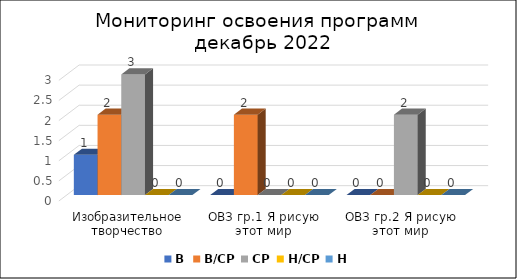
| Category | В | В/СР | СР | Н/СР | Н |
|---|---|---|---|---|---|
| Изобразительное творчество | 1 | 2 | 3 | 0 | 0 |
| ОВЗ гр.1 Я рисую этот мир | 0 | 2 | 0 | 0 | 0 |
| ОВЗ гр.2 Я рисую этот мир | 0 | 0 | 2 | 0 | 0 |